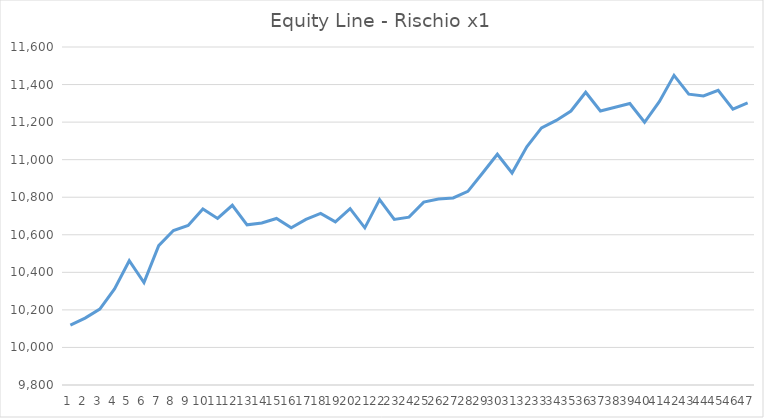
| Category | Series 0 |
|---|---|
| 0 | 10119 |
| 1 | 10156 |
| 2 | 10204 |
| 3 | 10312 |
| 4 | 10462 |
| 5 | 10346 |
| 6 | 10542 |
| 7 | 10623 |
| 8 | 10650 |
| 9 | 10737 |
| 10 | 10687 |
| 11 | 10757 |
| 12 | 10653 |
| 13 | 10663 |
| 14 | 10687 |
| 15 | 10637 |
| 16 | 10682 |
| 17 | 10714 |
| 18 | 10669 |
| 19 | 10739 |
| 20 | 10637 |
| 21 | 10787 |
| 22 | 10682 |
| 23 | 10694 |
| 24 | 10774 |
| 25 | 10790 |
| 26 | 10796 |
| 27 | 10831 |
| 28 | 10929 |
| 29 | 11029 |
| 30 | 10929 |
| 31 | 11069 |
| 32 | 11169 |
| 33 | 11209 |
| 34 | 11259 |
| 35 | 11359 |
| 36 | 11259 |
| 37 | 11279 |
| 38 | 11299 |
| 39 | 11199 |
| 40 | 11309 |
| 41 | 11449 |
| 42 | 11349 |
| 43 | 11339 |
| 44 | 11369 |
| 45 | 11269 |
| 46 | 11302 |